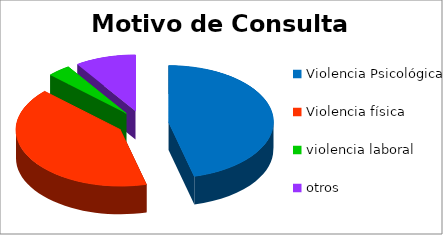
| Category | Series 0 |
|---|---|
| Violencia Psicológica | 64 |
| Violencia física | 57 |
| violencia laboral | 5 |
| otros | 13 |